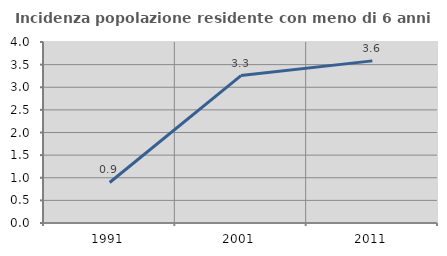
| Category | Incidenza popolazione residente con meno di 6 anni |
|---|---|
| 1991.0 | 0.896 |
| 2001.0 | 3.257 |
| 2011.0 | 3.583 |